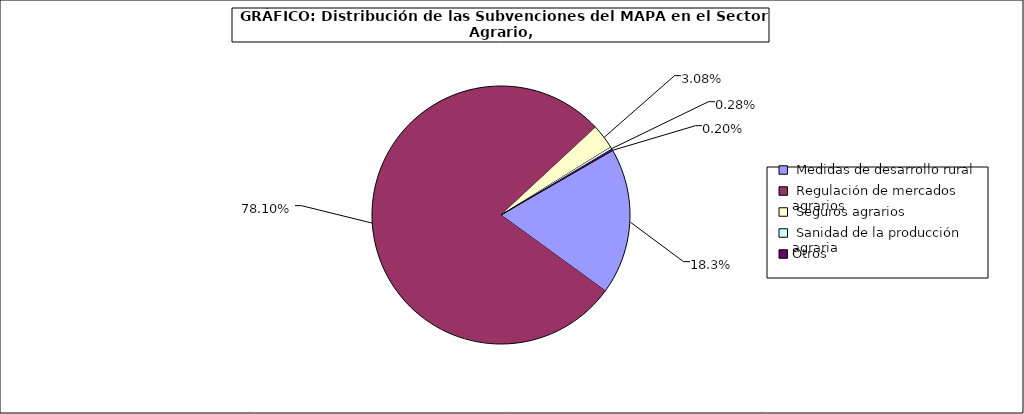
| Category | Series 0 |
|---|---|
|  Medidas de desarrollo rural | 1409645.14 |
|  Regulación de mercados agrarios | 6004597.93 |
|  Seguros agrarios | 236908.46 |
|  Sanidad de la producción agraria | 21674.85 |
| Otros | 15514.3 |